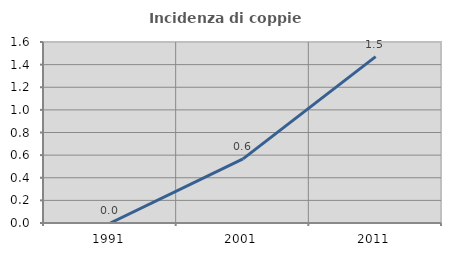
| Category | Incidenza di coppie miste |
|---|---|
| 1991.0 | 0 |
| 2001.0 | 0.567 |
| 2011.0 | 1.471 |